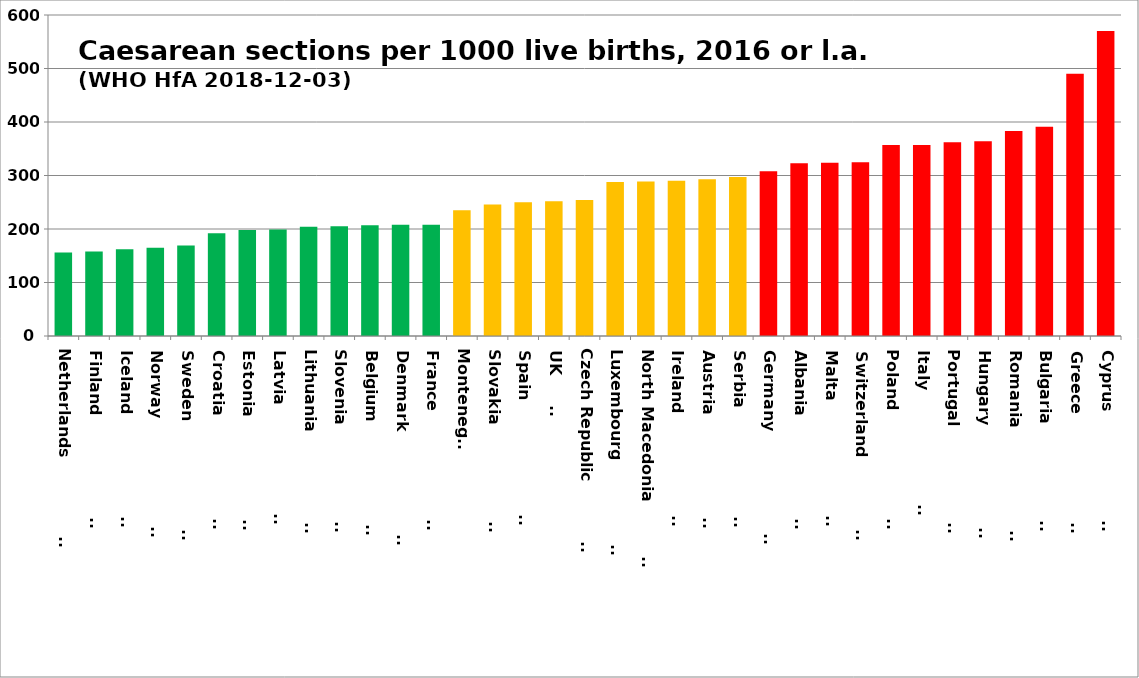
| Category | Series 0 |
|---|---|
| Netherlands                   | 156 |
| Finland                       | 158 |
| Iceland                       | 162 |
| Norway                        | 165 |
| Sweden                        | 169 |
| Croatia                       | 192 |
| Estonia                       | 198 |
| Latvia                        | 199 |
| Lithuania                     | 204 |
| Slovenia                      | 205 |
| Belgium                       | 207 |
| Denmark                       | 208 |
| France                        | 208 |
| Montenegro | 235 |
| Slovakia                      | 246 |
| Spain                         | 250 |
| UK         | 252 |
| Czech Republic                | 254 |
| Luxembourg                    | 288 |
| North Macedonia                | 289 |
| Ireland                       | 290 |
| Austria                       | 293 |
| Serbia                        | 297 |
| Germany                       | 308 |
| Albania                       | 323 |
| Malta                         | 324 |
| Switzerland                   | 325 |
| Poland                        | 357 |
| Italy                         | 357 |
| Portugal                      | 362 |
| Hungary                       | 364 |
| Romania                       | 383 |
| Bulgaria                      | 391 |
| Greece                        | 490 |
| Cyprus                        | 570 |